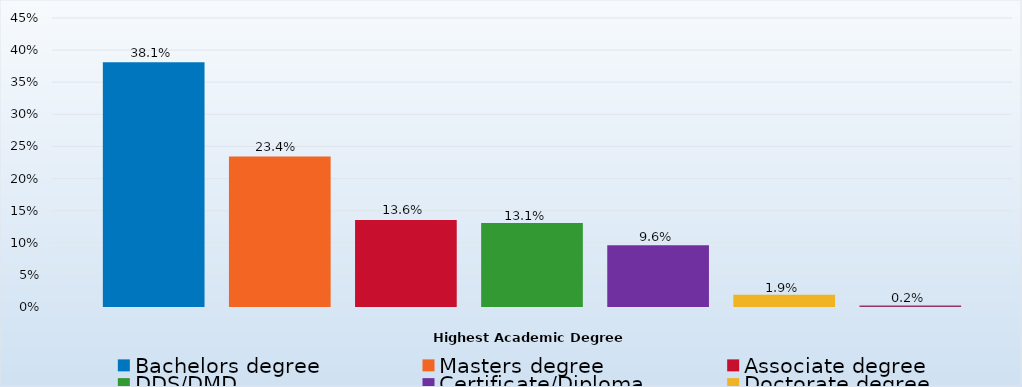
| Category | Bachelors degree | Masters degree | Associate degree | DDS/DMD | Certificate/Diploma | Doctorate degree | Other |
|---|---|---|---|---|---|---|---|
| Percent | 0.381 | 0.234 | 0.136 | 0.131 | 0.096 | 0.019 | 0.002 |